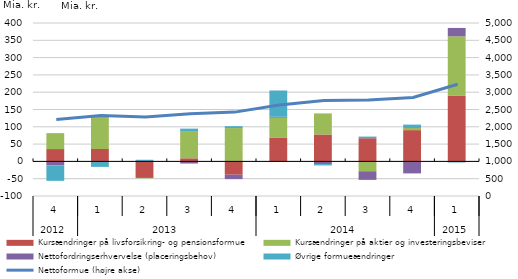
| Category | Kursændringer på livsforsikring- og pensionsformue | Kursændringer på aktier og investeringsbeviser | Nettofordringserhvervelse (placeringsbehov) | Øvrige formueændringer |
|---|---|---|---|---|
| 0 | 35.7 | 46 | -11.5 | -44.6 |
| 1 | 35.8 | 95.1 | 2.2 | -15.8 |
| 2 | -47.8 | -1.2 | 0.6 | 4.1 |
| 3 | 9 | 76.8 | -6.2 | 8.9 |
| 4 | -38.5 | 96.4 | -12.7 | 5.4 |
| 5 | 69.2 | 57.1 | 2.7 | 75.9 |
| 6 | 77.9 | 60.8 | -7.7 | -4 |
| 7 | 67 | -28.4 | -25 | 4.7 |
| 8 | 90.4 | 6.2 | -34.7 | 9.7 |
| 9 | 190.6 | 171 | 24.1 | -3.2 |